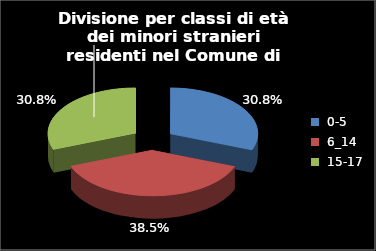
| Category | Series 0 |
|---|---|
| 0-5 | 4 |
| 6_14 | 5 |
| 15-17 | 4 |